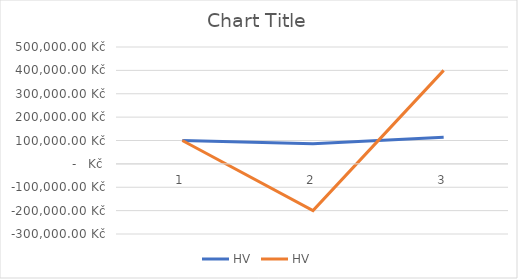
| Category | HV |
|---|---|
| 0 | 100000 |
| 1 | -200000 |
| 2 | 400000 |